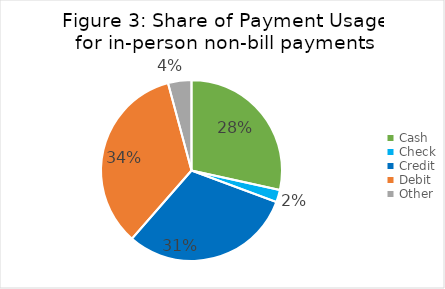
| Category | 2020 |
|---|---|
| Cash | 0.285 |
| Check | 0.022 |
| Credit | 0.308 |
| Debit | 0.344 |
| Other | 0.042 |